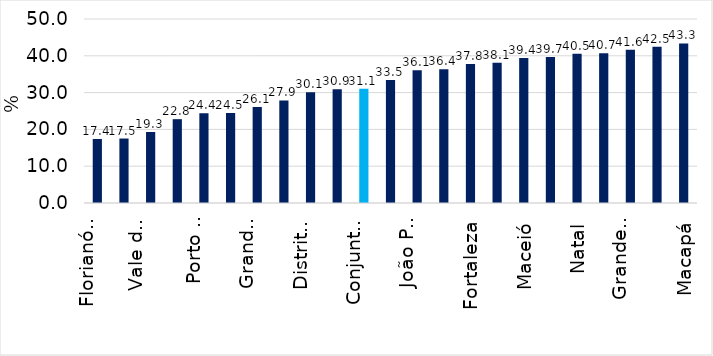
| Category | Series 0 |
|---|---|
| Florianópolis | 17.395 |
| Curitiba | 17.52 |
| Vale do Rio Cuiabá | 19.296 |
| Goiânia | 22.781 |
| Porto Alegre | 24.372 |
| São Paulo | 24.46 |
| Grande Vitória | 26.065 |
| Belo Horizonte | 27.875 |
| Distrito Federal | 30.071 |
| Belém | 30.898 |
| Conjunto RMs | 31.067 |
| Rio de Janeiro | 33.454 |
| João Pessoa | 36.101 |
| Teresina | 36.358 |
| Fortaleza | 37.803 |
| Manaus | 38.123 |
| Maceió | 39.435 |
| Recife | 39.653 |
| Natal | 40.549 |
| Salvador | 40.665 |
| Grande São Luís | 41.63 |
| Aracaju | 42.493 |
| Macapá | 43.342 |